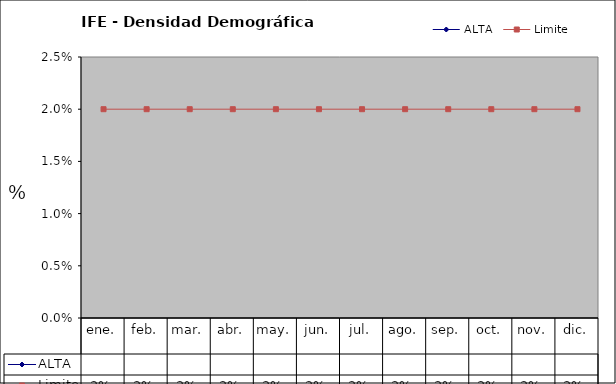
| Category | ALTA | Limite |
|---|---|---|
| ene. |  | 0.02 |
| feb. |  | 0.02 |
| mar. |  | 0.02 |
| abr. |  | 0.02 |
| may. |  | 0.02 |
| jun. |  | 0.02 |
| jul. |  | 0.02 |
| ago. |  | 0.02 |
| sep. |  | 0.02 |
| oct. |  | 0.02 |
| nov. |  | 0.02 |
| dic. |  | 0.02 |